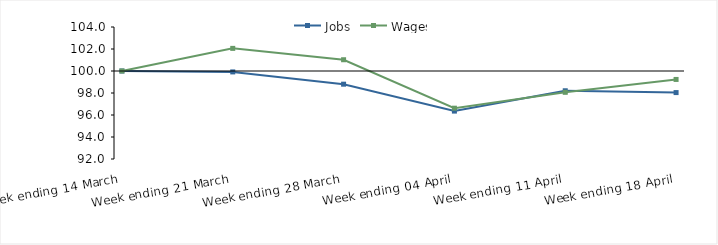
| Category | Jobs | Wages |
|---|---|---|
| 0 | 100 | 100 |
| 1900-01-01 | 99.917 | 102.057 |
| 1900-01-02 | 98.802 | 101.024 |
| 1900-01-03 | 96.355 | 96.619 |
| 1900-01-04 | 98.203 | 98.062 |
| 1900-01-05 | 98.038 | 99.233 |